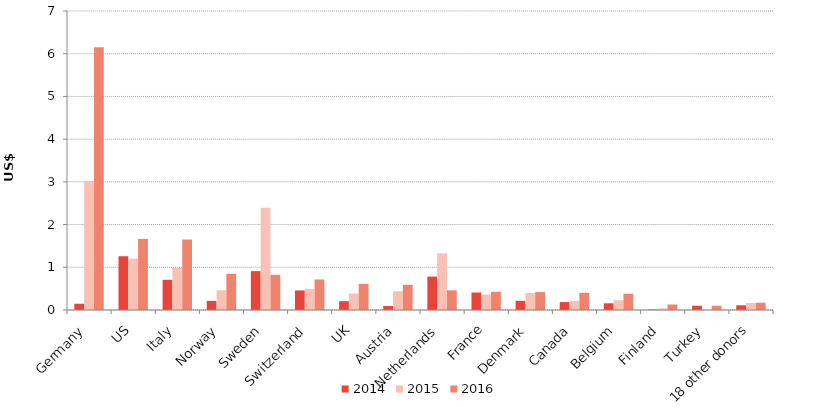
| Category | 2014 | 2015 | 2016 |
|---|---|---|---|
|     Germany | 0.146 | 3.019 | 6.152 |
| US | 1.259 | 1.202 | 1.665 |
|     Italy | 0.707 | 0.983 | 1.65 |
|     Norway | 0.213 | 0.463 | 0.847 |
|     Sweden | 0.91 | 2.397 | 0.824 |
|     Switzerland | 0.457 | 0.498 | 0.714 |
| UK | 0.207 | 0.385 | 0.613 |
|     Austria | 0.093 | 0.439 | 0.59 |
|     Netherlands | 0.783 | 1.326 | 0.46 |
|     France | 0.408 | 0.363 | 0.426 |
|     Denmark | 0.216 | 0.397 | 0.42 |
|     Canada | 0.186 | 0.213 | 0.403 |
|     Belgium | 0.157 | 0.228 | 0.382 |
|     Finland | 0.014 | 0.039 | 0.129 |
|     Turkey | 0.1 | 0 | 0.1 |
| 18 other donors | 0.11 | 0.164 | 0.171 |